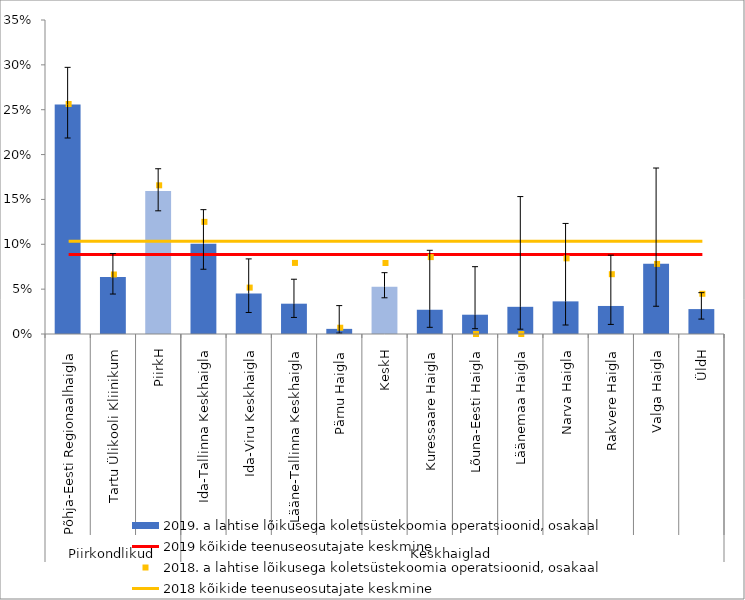
| Category | 2019. a lahtise lõikusega koletsüstekoomia operatsioonid, osakaal |
|---|---|
| 0 | 0.256 |
| 1 | 0.063 |
| 2 | 0.159 |
| 3 | 0.101 |
| 4 | 0.045 |
| 5 | 0.034 |
| 6 | 0.006 |
| 7 | 0.053 |
| 8 | 0.027 |
| 9 | 0.022 |
| 10 | 0.03 |
| 11 | 0.036 |
| 12 | 0.031 |
| 13 | 0.078 |
| 14 | 0.028 |